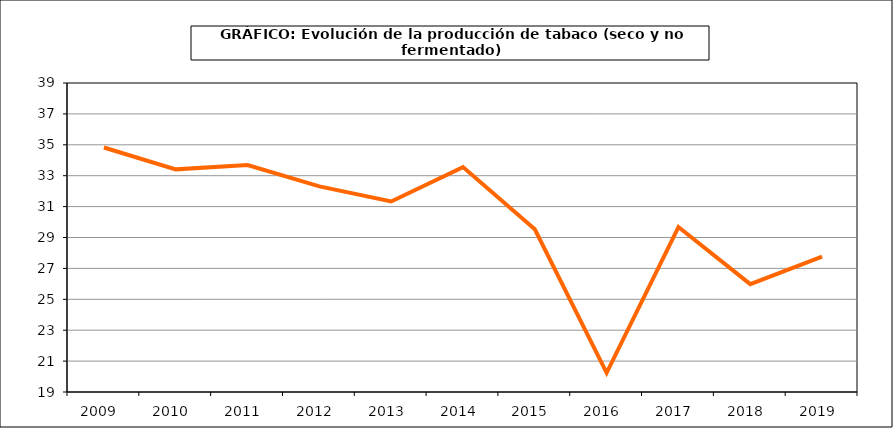
| Category | Producción |
|---|---|
| 2009.0 | 34.827 |
| 2010.0 | 33.41 |
| 2011.0 | 33.692 |
| 2012.0 | 32.308 |
| 2013.0 | 31.333 |
| 2014.0 | 33.557 |
| 2015.0 | 29.534 |
| 2016.0 | 20.238 |
| 2017.0 | 29.679 |
| 2018.0 | 25.983 |
| 2019.0 | 27.766 |